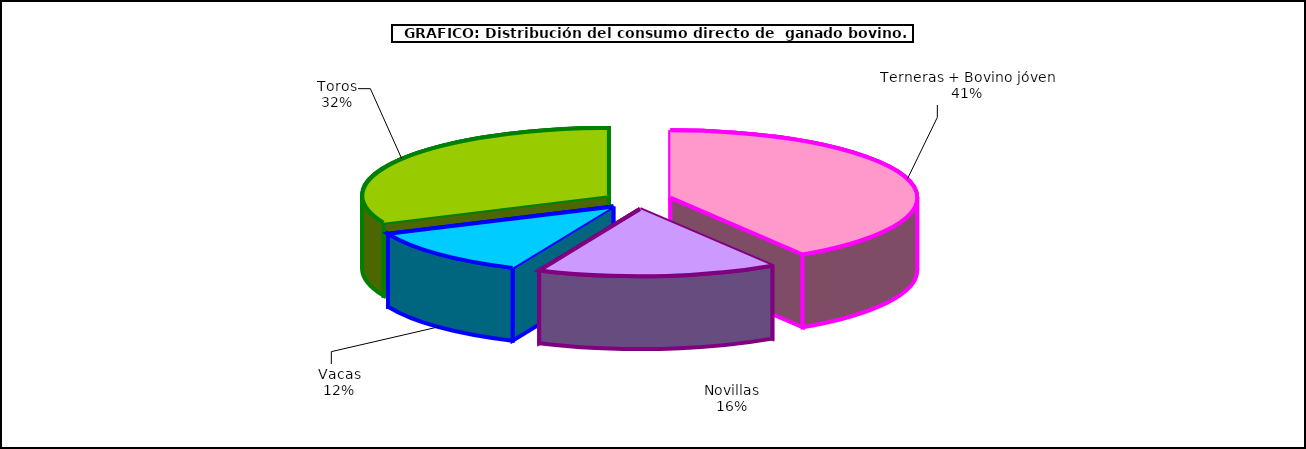
| Category | Series 0 |
|---|---|
| Terneras + Bovino jóven | 227419.167 |
| Novillas | 87067.128 |
| Vacas | 64433.186 |
| Toros | 175793.541 |